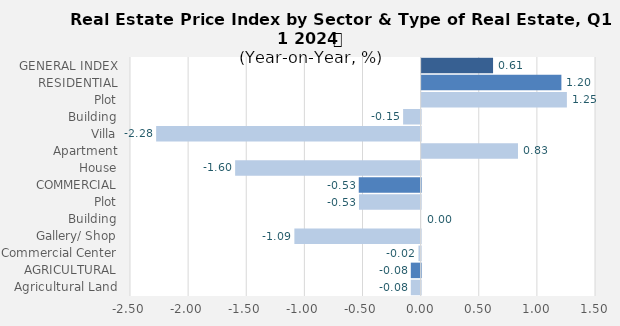
| Category | Q1- 2023 |
|---|---|
| GENERAL INDEX | 0.615 |
| RESIDENTIAL | 1.202 |
| Plot | 1.25 |
| Building | -0.151 |
| Villa | -2.275 |
| Apartment | 0.829 |
| House | -1.596 |
| COMMERCIAL | -0.532 |
| Plot | -0.53 |
| Building | 0 |
| Gallery/ Shop | -1.086 |
| Commercial Center | -0.019 |
| AGRICULTURAL | -0.084 |
| Agricultural Land | -0.084 |